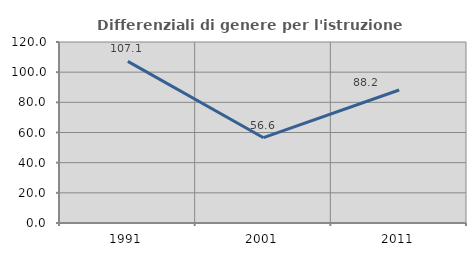
| Category | Differenziali di genere per l'istruzione superiore |
|---|---|
| 1991.0 | 107.143 |
| 2001.0 | 56.562 |
| 2011.0 | 88.182 |